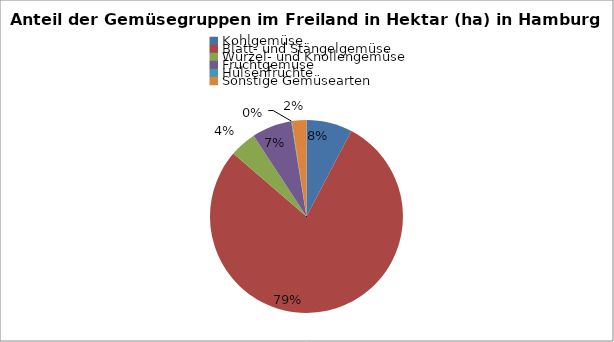
| Category | Series 0 |
|---|---|
| Kohlgemüse  | 39.9 |
| Blatt- und Stängelgemüse | 408.1 |
| Wurzel- und Knollengemüse | 23.2 |
| Fruchtgemüse | 34.7 |
| Hülsenfrüchte | 0.6 |
| Sonstige Gemüsearten | 12.6 |